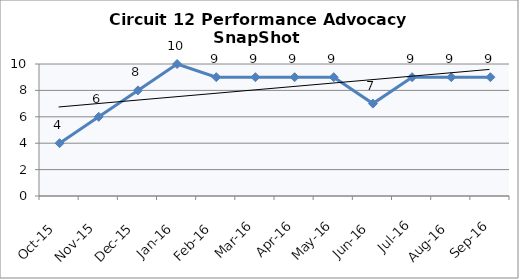
| Category | Circuit 12 |
|---|---|
| Oct-15 | 4 |
| Nov-15 | 6 |
| Dec-15 | 8 |
| Jan-16 | 10 |
| Feb-16 | 9 |
| Mar-16 | 9 |
| Apr-16 | 9 |
| May-16 | 9 |
| Jun-16 | 7 |
| Jul-16 | 9 |
| Aug-16 | 9 |
| Sep-16 | 9 |